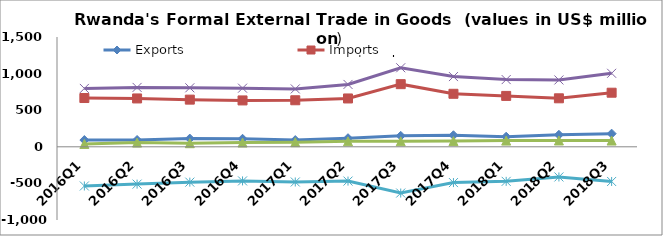
| Category | Exports | Imports | Re-Exports | Total Trade | Trade Balance |
|---|---|---|---|---|---|
| 2016Q1 | 92.097 | 666.431 | 38.936 | 797.464 | -535.397 |
| 2016Q2 | 93.292 | 660.603 | 57.563 | 811.457 | -509.748 |
| 2016Q3 | 112.41 | 644.459 | 49.15 | 806.019 | -482.9 |
| 2016Q4 | 109.497 | 633.547 | 57.935 | 800.978 | -466.115 |
| 2017Q1 | 92.022 | 635.792 | 63.008 | 790.823 | -480.761 |
| 2017Q2 | 117.438 | 660.301 | 74.393 | 852.132 | -468.47 |
| 2017Q3 | 149.648 | 855.748 | 74.341 | 1079.737 | -631.759 |
| 2017Q4 | 157.625 | 724.154 | 77.699 | 959.478 | -488.83 |
| 2018Q1 | 138.148 | 695.167 | 84.902 | 918.217 | -472.118 |
| 2018Q2 | 164.034 | 662.549 | 86.48 | 913.063 | -412.035 |
| 2018Q3 | 179.734 | 738.972 | 85.612 | 1004.318 | -473.627 |